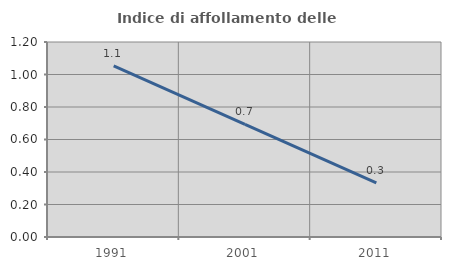
| Category | Indice di affollamento delle abitazioni  |
|---|---|
| 1991.0 | 1.053 |
| 2001.0 | 0.693 |
| 2011.0 | 0.333 |